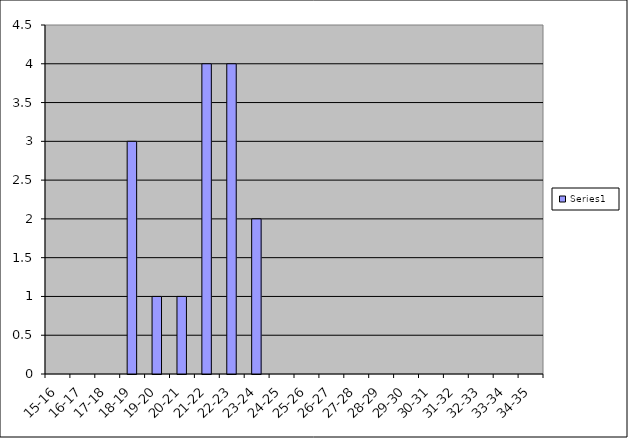
| Category | Series 0 |
|---|---|
| 15-16 | 0 |
| 16-17 | 0 |
| 17-18 | 0 |
| 18-19 | 3 |
| 19-20 | 1 |
| 20-21 | 1 |
| 21-22 | 4 |
| 22-23 | 4 |
| 23-24 | 2 |
| 24-25 | 0 |
| 25-26 | 0 |
| 26-27 | 0 |
| 27-28 | 0 |
| 28-29 | 0 |
| 29-30 | 0 |
| 30-31 | 0 |
| 31-32 | 0 |
| 32-33 | 0 |
| 33-34 | 0 |
| 34-35 | 0 |